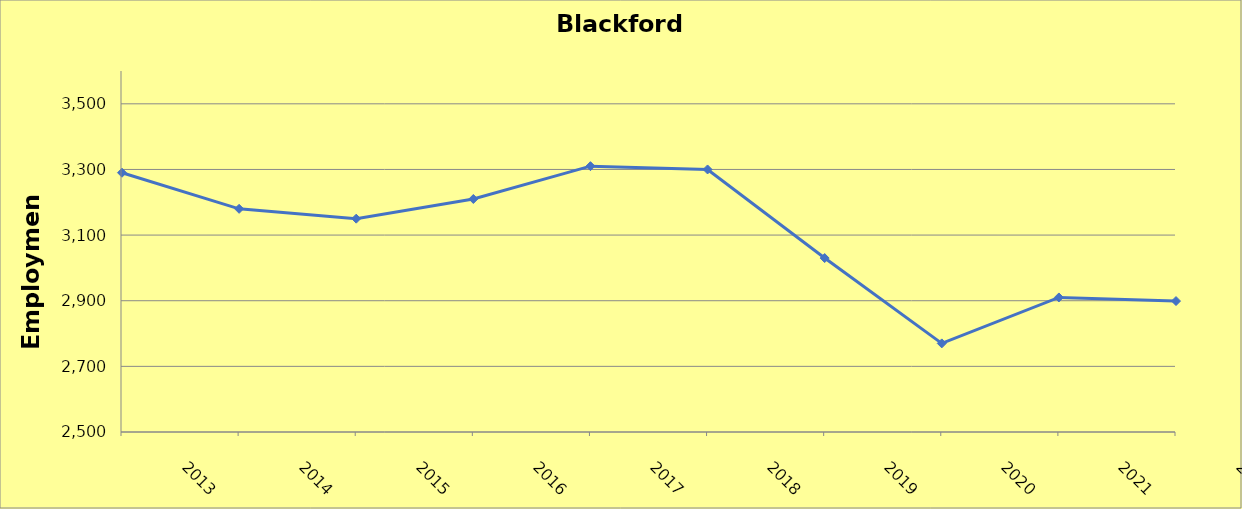
| Category | Blackford County |
|---|---|
| 2013.0 | 3290 |
| 2014.0 | 3180 |
| 2015.0 | 3150 |
| 2016.0 | 3210 |
| 2017.0 | 3310 |
| 2018.0 | 3300 |
| 2019.0 | 3030 |
| 2020.0 | 2770 |
| 2021.0 | 2910 |
| 2022.0 | 2899 |